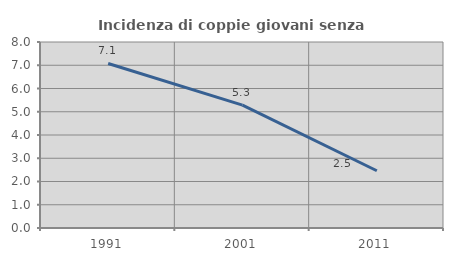
| Category | Incidenza di coppie giovani senza figli |
|---|---|
| 1991.0 | 7.078 |
| 2001.0 | 5.285 |
| 2011.0 | 2.462 |